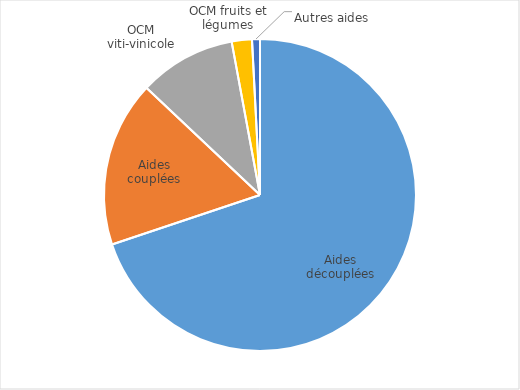
| Category | Series 0 |
|---|---|
| Aides découplées | 0.699 |
| Aides couplées | 0.172 |
| OCM viti-vinicole | 0.1 |
| OCM fruits et légumes | 0.021 |
| Autres aides  | 0.008 |